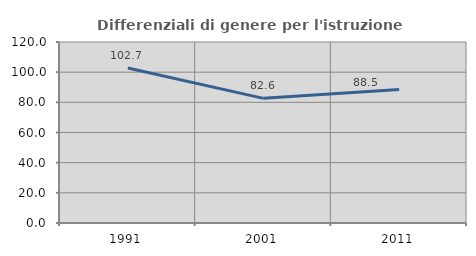
| Category | Differenziali di genere per l'istruzione superiore |
|---|---|
| 1991.0 | 102.745 |
| 2001.0 | 82.642 |
| 2011.0 | 88.504 |